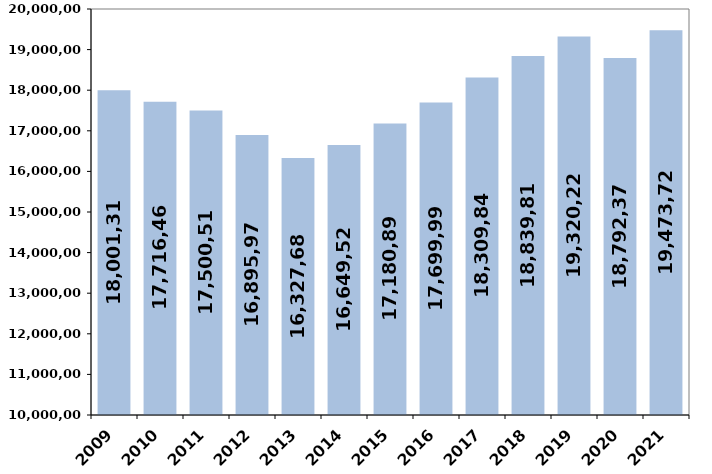
| Category | % de variación
 interanual |
|---|---|
| 2009 | 18001310.04 |
| 2010 | 17716464.27 |
| 2011 | 17500517.37 |
| 2012 | 16895976.9 |
| 2013 | 16327687.18 |
| 2014 | 16649520.5 |
| 2015 | 17180898.9 |
| 2016 | 17699995.29 |
| 2017 | 18309843.89 |
| 2018 | 18839813.77 |
| 2019 | 19320227 |
| 2020 | 18792376 |
| 2021 | 19473724.091 |